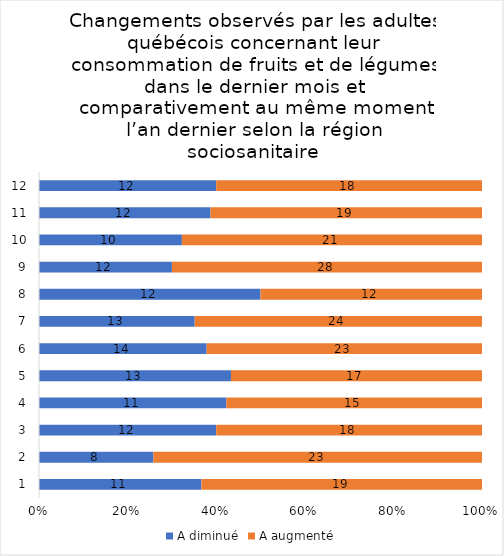
| Category | A diminué | A augmenté |
|---|---|---|
| 0 | 11 | 19 |
| 1 | 8 | 23 |
| 2 | 12 | 18 |
| 3 | 11 | 15 |
| 4 | 13 | 17 |
| 5 | 14 | 23 |
| 6 | 13 | 24 |
| 7 | 12 | 12 |
| 8 | 12 | 28 |
| 9 | 10 | 21 |
| 10 | 12 | 19 |
| 11 | 12 | 18 |